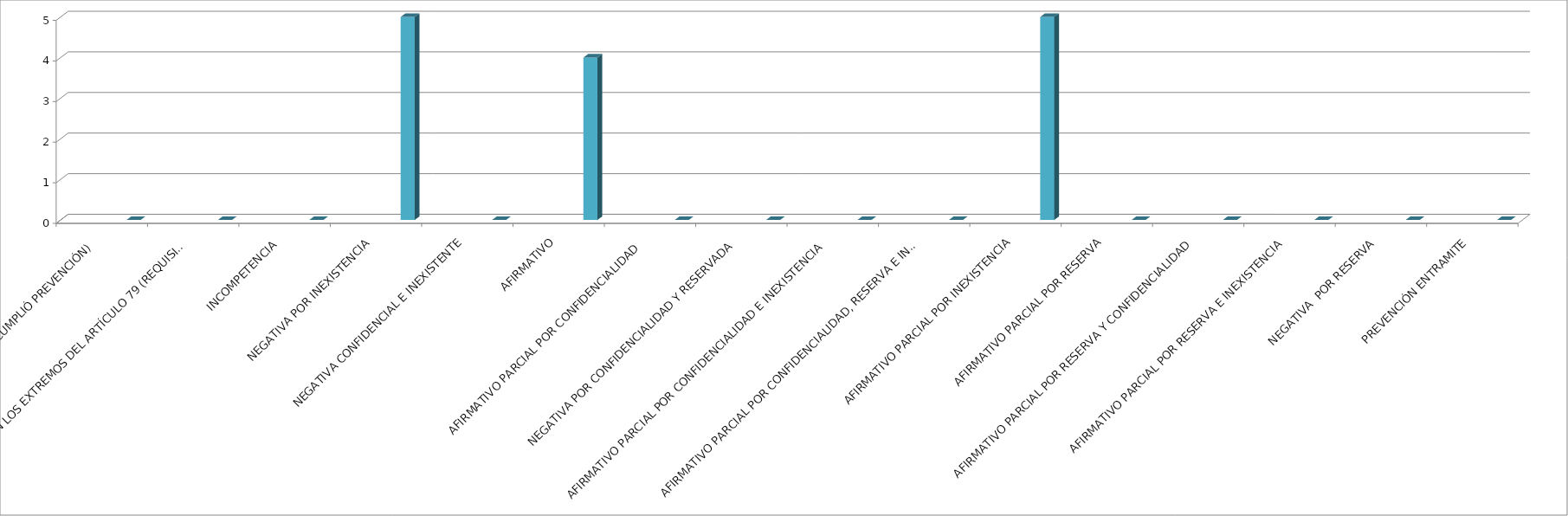
| Category | Series 0 | Series 1 | Series 2 | Series 3 | Series 4 |
|---|---|---|---|---|---|
| SE TIENE POR NO PRESENTADA ( NO CUMPLIÓ PREVENCIÓN) |  |  |  |  | 0 |
| NO CUMPLIO CON LOS EXTREMOS DEL ARTÍCULO 79 (REQUISITOS) |  |  |  |  | 0 |
| INCOMPETENCIA  |  |  |  |  | 0 |
| NEGATIVA POR INEXISTENCIA |  |  |  |  | 5 |
| NEGATIVA CONFIDENCIAL E INEXISTENTE |  |  |  |  | 0 |
| AFIRMATIVO |  |  |  |  | 4 |
| AFIRMATIVO PARCIAL POR CONFIDENCIALIDAD  |  |  |  |  | 0 |
| NEGATIVA POR CONFIDENCIALIDAD Y RESERVADA |  |  |  |  | 0 |
| AFIRMATIVO PARCIAL POR CONFIDENCIALIDAD E INEXISTENCIA |  |  |  |  | 0 |
| AFIRMATIVO PARCIAL POR CONFIDENCIALIDAD, RESERVA E INEXISTENCIA |  |  |  |  | 0 |
| AFIRMATIVO PARCIAL POR INEXISTENCIA |  |  |  |  | 5 |
| AFIRMATIVO PARCIAL POR RESERVA |  |  |  |  | 0 |
| AFIRMATIVO PARCIAL POR RESERVA Y CONFIDENCIALIDAD |  |  |  |  | 0 |
| AFIRMATIVO PARCIAL POR RESERVA E INEXISTENCIA |  |  |  |  | 0 |
| NEGATIVA  POR RESERVA |  |  |  |  | 0 |
| PREVENCIÓN ENTRAMITE |  |  |  |  | 0 |